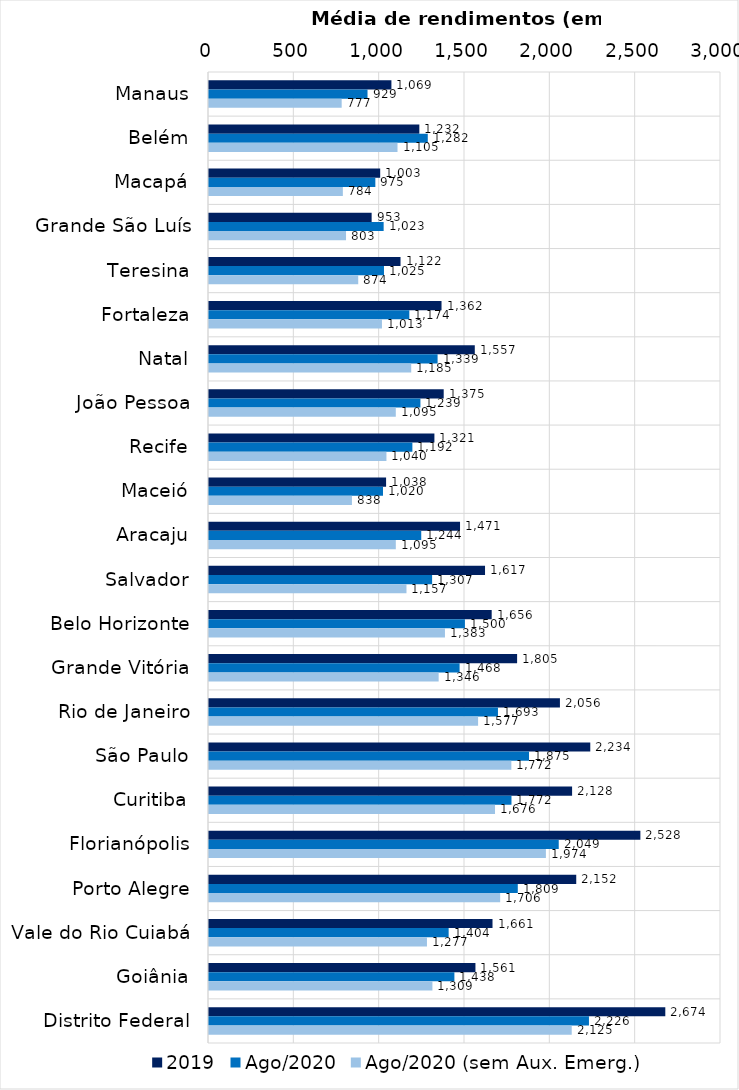
| Category | 2019 | Ago/2020 | Ago/2020 (sem Aux. Emerg.) |
|---|---|---|---|
| Manaus | 1068.828 | 928.839 | 777.388 |
| Belém | 1232.455 | 1281.882 | 1104.539 |
| Macapá | 1003.13 | 974.677 | 784.268 |
| Grande São Luís | 952.951 | 1023.325 | 802.863 |
| Teresina | 1122.229 | 1025.309 | 874.411 |
| Fortaleza | 1362.448 | 1173.686 | 1013.354 |
| Natal | 1557.335 | 1339.43 | 1184.889 |
| João Pessoa | 1375.171 | 1238.758 | 1094.522 |
| Recife | 1320.74 | 1191.677 | 1039.68 |
| Maceió | 1037.615 | 1019.507 | 837.522 |
| Aracaju | 1470.893 | 1243.616 | 1094.6 |
| Salvador | 1617.354 | 1307.288 | 1157.075 |
| Belo Horizonte | 1656.386 | 1499.504 | 1382.575 |
| Grande Vitória | 1805.345 | 1468.36 | 1345.679 |
| Rio de Janeiro | 2056.19 | 1693.153 | 1576.721 |
| São Paulo | 2234.06 | 1875.074 | 1771.578 |
| Curitiba | 2127.508 | 1772.36 | 1675.834 |
| Florianópolis | 2527.651 | 2049.244 | 1974.052 |
| Porto Alegre | 2151.805 | 1809.31 | 1706.044 |
| Vale do Rio Cuiabá | 1661.18 | 1404.173 | 1277.137 |
| Goiânia | 1561.194 | 1437.864 | 1309.05 |
| Distrito Federal | 2673.676 | 2226.307 | 2125.35 |